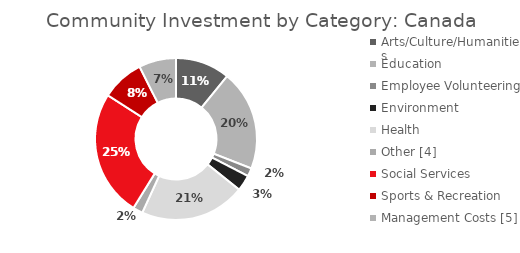
| Category | Series 0 |
|---|---|
| Arts/Culture/Humanities | 0.109 |
| Education | 0.201 |
| Employee Volunteering  | 0.016 |
| Environment | 0.032 |
| Health | 0.211 |
| Other [4] | 0.02 |
| Social Services | 0.253 |
| Sports & Recreation | 0.085 |
| Management Costs [5] | 0.074 |